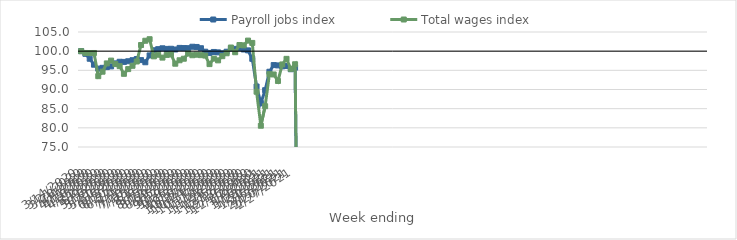
| Category | Payroll jobs index | Total wages index |
|---|---|---|
| 14/03/2020 | 100 | 100 |
| 21/03/2020 | 99.307 | 99.529 |
| 28/03/2020 | 98.024 | 99.517 |
| 04/04/2020 | 96.473 | 99.526 |
| 11/04/2020 | 95.45 | 93.48 |
| 18/04/2020 | 95.65 | 94.646 |
| 25/04/2020 | 95.849 | 96.804 |
| 02/05/2020 | 96.032 | 97.539 |
| 09/05/2020 | 96.812 | 96.63 |
| 16/05/2020 | 97.232 | 96.096 |
| 23/05/2020 | 97.201 | 94.089 |
| 30/05/2020 | 97.37 | 95.32 |
| 06/06/2020 | 97.643 | 96.185 |
| 13/06/2020 | 97.953 | 97.308 |
| 20/06/2020 | 97.664 | 101.603 |
| 27/06/2020 | 97.107 | 102.718 |
| 04/07/2020 | 98.896 | 103.118 |
| 11/07/2020 | 100.236 | 98.646 |
| 18/07/2020 | 100.524 | 99.067 |
| 25/07/2020 | 100.746 | 98.323 |
| 01/08/2020 | 100.591 | 99.022 |
| 08/08/2020 | 100.625 | 99.16 |
| 15/08/2020 | 100.442 | 96.727 |
| 22/08/2020 | 100.852 | 97.626 |
| 29/08/2020 | 100.81 | 98.028 |
| 05/09/2020 | 100.782 | 99.372 |
| 12/09/2020 | 101.155 | 98.943 |
| 19/09/2020 | 101.097 | 99.075 |
| 26/09/2020 | 100.768 | 98.962 |
| 03/10/2020 | 99.866 | 98.853 |
| 10/10/2020 | 99.541 | 96.625 |
| 17/10/2020 | 99.792 | 98.062 |
| 24/10/2020 | 99.687 | 97.601 |
| 31/10/2020 | 99.433 | 98.696 |
| 07/11/2020 | 99.859 | 99.452 |
| 14/11/2020 | 100.683 | 100.955 |
| 21/11/2020 | 100.598 | 99.722 |
| 28/11/2020 | 100.792 | 101.601 |
| 05/12/2020 | 100.436 | 101.522 |
| 12/12/2020 | 100.207 | 102.755 |
| 19/12/2020 | 97.997 | 102.15 |
| 26/12/2020 | 90.788 | 89.421 |
| 02/01/2021 | 86.47 | 80.549 |
| 09/01/2021 | 89.82 | 85.636 |
| 16/01/2021 | 94.63 | 94.003 |
| 23/01/2021 | 96.37 | 93.923 |
| 30/01/2021 | 96.284 | 92.224 |
| 06/02/2021 | 96.044 | 96.538 |
| 13/02/2021 | 96.14 | 97.997 |
| 20/02/2021 | 95.284 | 95.382 |
| 27/02/2021 | 95.702 | 96.581 |